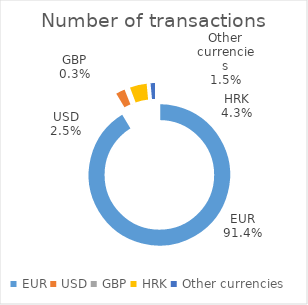
| Category | Number of transactions  |
|---|---|
| EUR | 6324635 |
| USD | 174737 |
| GBP | 20535 |
| HRK | 297553 |
| Other currencies | 100575 |